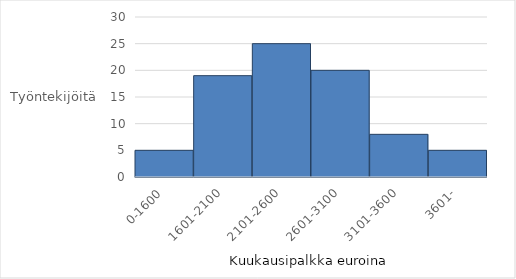
| Category | Series 0 |
|---|---|
| 0-1600 | 5 |
| 1601-2100 | 19 |
| 2101-2600 | 25 |
| 2601-3100 | 20 |
| 3101-3600 | 8 |
| 3601- | 5 |